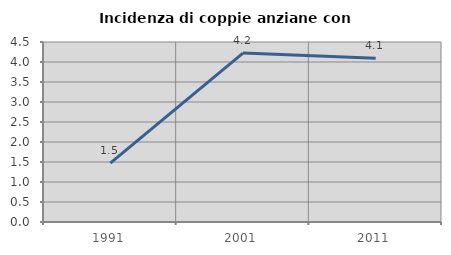
| Category | Incidenza di coppie anziane con figli |
|---|---|
| 1991.0 | 1.474 |
| 2001.0 | 4.222 |
| 2011.0 | 4.092 |